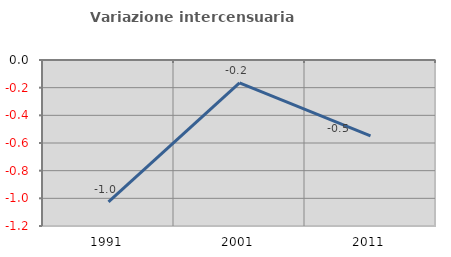
| Category | Variazione intercensuaria annua |
|---|---|
| 1991.0 | -1.025 |
| 2001.0 | -0.166 |
| 2011.0 | -0.548 |